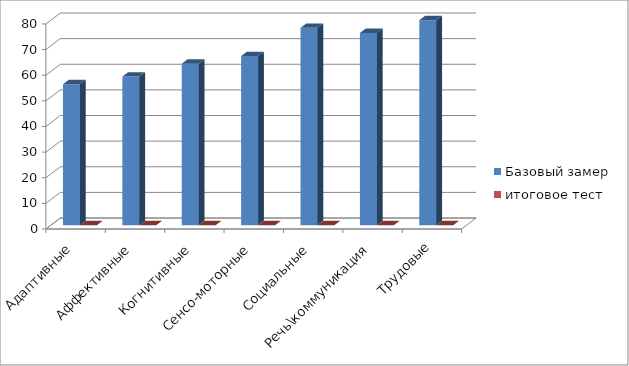
| Category | Базовый замер | итоговое тест |
|---|---|---|
| Адаптивные | 55 | 0 |
| Аффективные | 58 | 0 |
| Когнитивные | 63 | 0 |
| Сенсо-моторные | 66 | 0 |
| Социальные | 77 | 0 |
| Речь\коммуникация | 75 | 0 |
| Трудовые | 80 | 0 |